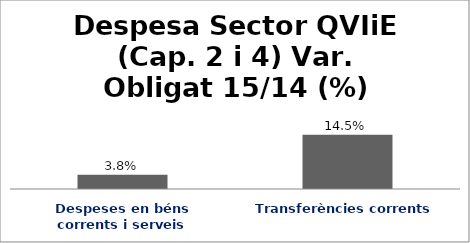
| Category | Series 0 |
|---|---|
| Despeses en béns corrents i serveis | 0.038 |
| Transferències corrents | 0.145 |